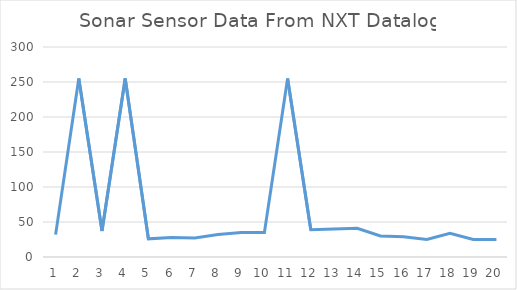
| Category | Series 0 |
|---|---|
| 0 | 32 |
| 1 | 255 |
| 2 | 37 |
| 3 | 255 |
| 4 | 26 |
| 5 | 28 |
| 6 | 27 |
| 7 | 32 |
| 8 | 35 |
| 9 | 35 |
| 10 | 255 |
| 11 | 39 |
| 12 | 40 |
| 13 | 41 |
| 14 | 30 |
| 15 | 29 |
| 16 | 25 |
| 17 | 34 |
| 18 | 25 |
| 19 | 25 |